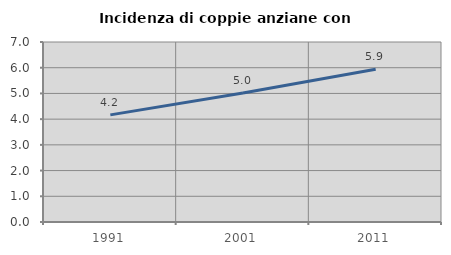
| Category | Incidenza di coppie anziane con figli |
|---|---|
| 1991.0 | 4.167 |
| 2001.0 | 5.017 |
| 2011.0 | 5.944 |